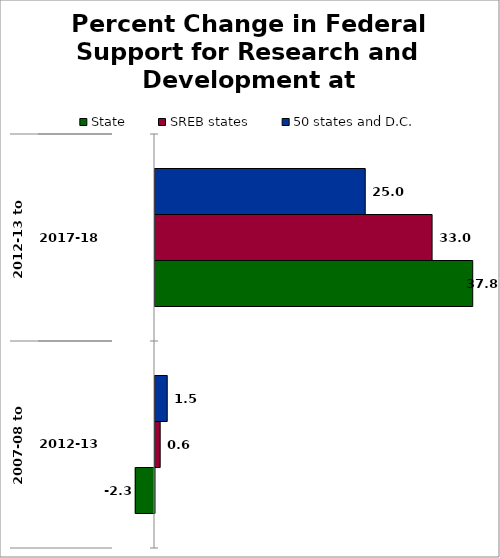
| Category | State | SREB states | 50 states and D.C. |
|---|---|---|---|
| 0 | -2.288 | 0.617 | 1.456 |
| 1 | 37.824 | 32.987 | 25.029 |